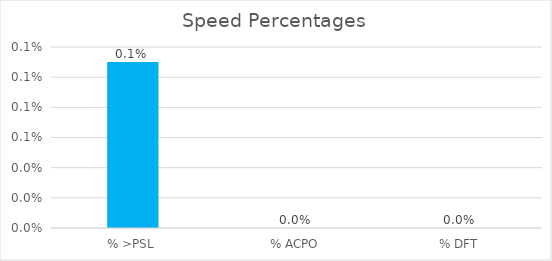
| Category | Series 0 |
|---|---|
| % >PSL | 0.001 |
| % ACPO | 0 |
| % DFT | 0 |